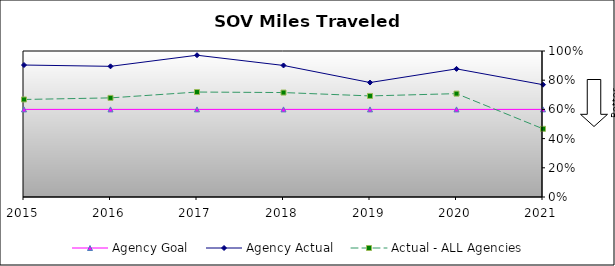
| Category | Agency Goal | Agency Actual | Actual - ALL Agencies |
|---|---|---|---|
| 2015.0 | 0.6 | 0.904 | 0.668 |
| 2016.0 | 0.6 | 0.895 | 0.679 |
| 2017.0 | 0.6 | 0.971 | 0.719 |
| 2018.0 | 0.6 | 0.901 | 0.715 |
| 2019.0 | 0.6 | 0.784 | 0.692 |
| 2020.0 | 0.6 | 0.878 | 0.708 |
| 2021.0 | 0.6 | 0.769 | 0.467 |